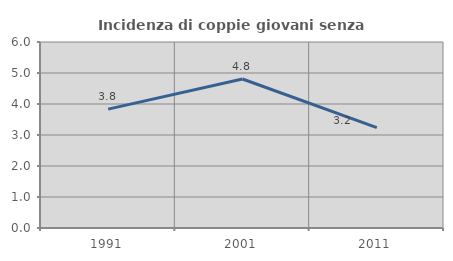
| Category | Incidenza di coppie giovani senza figli |
|---|---|
| 1991.0 | 3.834 |
| 2001.0 | 4.806 |
| 2011.0 | 3.239 |